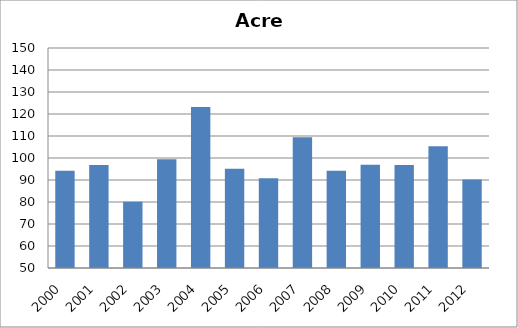
| Category | Tríplice viral/sarampo |
|---|---|
| 2000.0 | 94.22 |
| 2001.0 | 96.8 |
| 2002.0 | 80.08 |
| 2003.0 | 99.4 |
| 2004.0 | 123.22 |
| 2005.0 | 95.12 |
| 2006.0 | 90.84 |
| 2007.0 | 109.45 |
| 2008.0 | 94.17 |
| 2009.0 | 96.91 |
| 2010.0 | 96.87 |
| 2011.0 | 105.29 |
| 2012.0 | 90.28 |